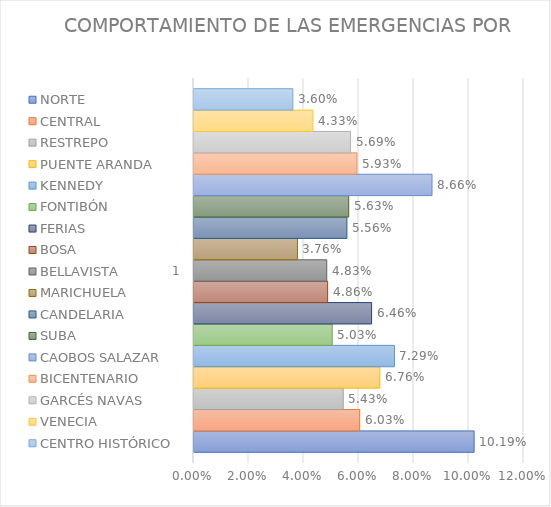
| Category | NORTE | CENTRAL | RESTREPO | PUENTE ARANDA | KENNEDY | FONTIBÓN | FERIAS | BOSA | BELLAVISTA | MARICHUELA | CANDELARIA | SUBA | CAOBOS SALAZAR | BICENTENARIO | GARCÉS NAVAS | VENECIA | CENTRO HISTÓRICO |
|---|---|---|---|---|---|---|---|---|---|---|---|---|---|---|---|---|---|
| 0 | 0.102 | 0.06 | 0.054 | 0.068 | 0.073 | 0.05 | 0.065 | 0.049 | 0.048 | 0.038 | 0.056 | 0.056 | 0.087 | 0.059 | 0.057 | 0.043 | 0.036 |